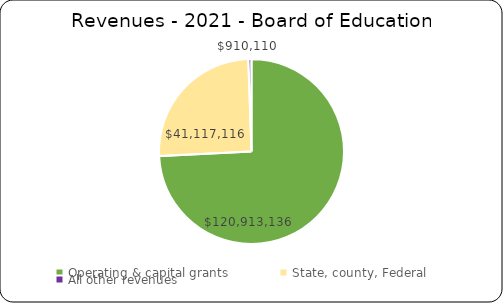
| Category | Series 0 |
|---|---|
| Operating & capital grants | 120913136 |
| State, county, Federal | 41117116 |
| All other revenues | 910110 |